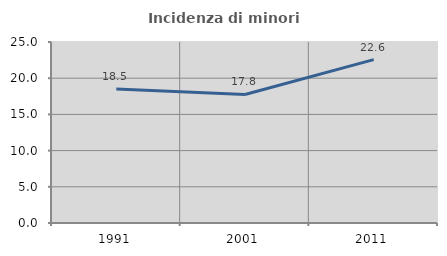
| Category | Incidenza di minori stranieri |
|---|---|
| 1991.0 | 18.519 |
| 2001.0 | 17.757 |
| 2011.0 | 22.559 |